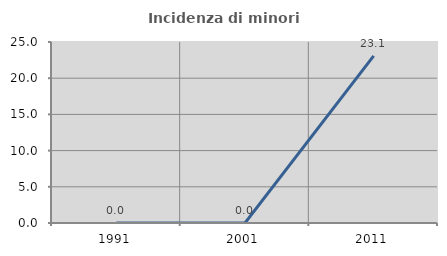
| Category | Incidenza di minori stranieri |
|---|---|
| 1991.0 | 0 |
| 2001.0 | 0 |
| 2011.0 | 23.077 |